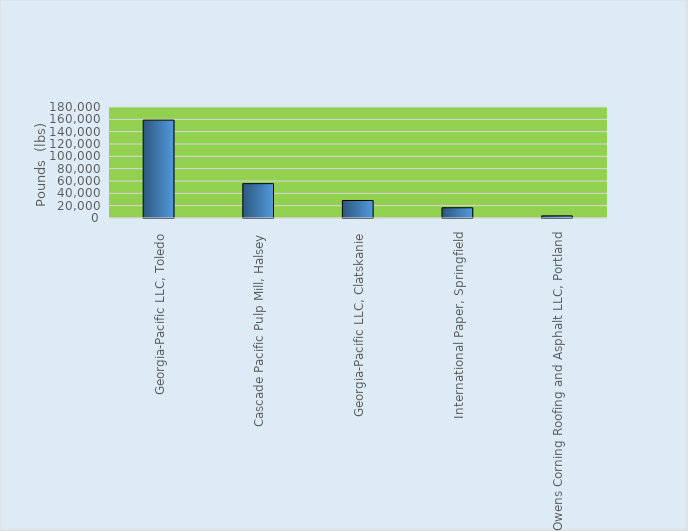
| Category | Series 0 |
|---|---|
| Georgia-Pacific LLC, Toledo | 158706 |
| Cascade Pacific Pulp Mill, Halsey | 55714 |
| Georgia-Pacific LLC, Clatskanie | 28400 |
| International Paper, Springfield | 16610 |
| Owens Corning Roofing and Asphalt LLC, Portland | 3451 |